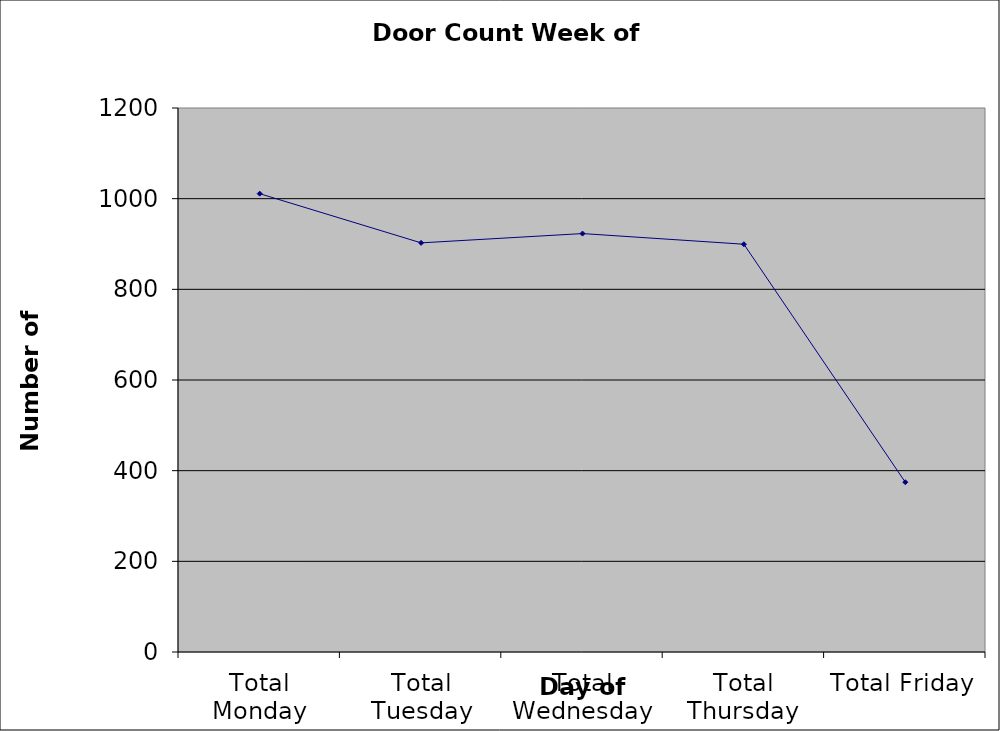
| Category | Series 0 |
|---|---|
| Total Monday | 1011 |
| Total Tuesday | 902.5 |
| Total Wednesday | 923 |
| Total Thursday | 899.5 |
| Total Friday | 374.5 |